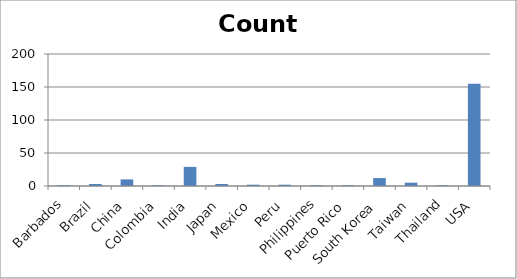
| Category | Count |
|---|---|
| Barbados | 1 |
| Brazil | 3 |
| China | 10 |
| Colombia | 1 |
| India | 29 |
| Japan | 3 |
| Mexico | 2 |
| Peru | 2 |
| Philippines | 1 |
| Puerto Rico | 1 |
| South Korea | 12 |
| Taiwan | 5 |
| Thailand | 1 |
| USA | 155 |